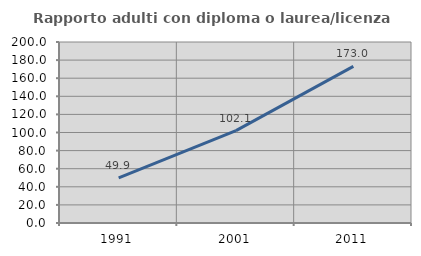
| Category | Rapporto adulti con diploma o laurea/licenza media  |
|---|---|
| 1991.0 | 49.884 |
| 2001.0 | 102.123 |
| 2011.0 | 173.048 |